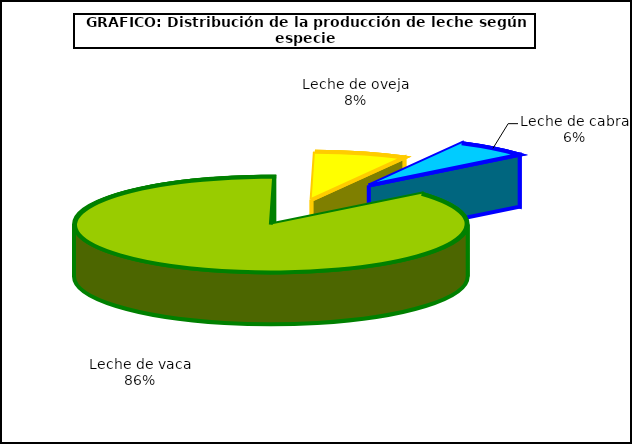
| Category | Leche(según especies) |
|---|---|
| Leche de vaca | 6582.284 |
| Leche de oveja | 574.682 |
| Leche de cabra | 463.094 |